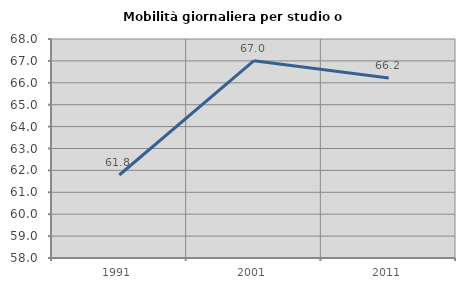
| Category | Mobilità giornaliera per studio o lavoro |
|---|---|
| 1991.0 | 61.791 |
| 2001.0 | 67.011 |
| 2011.0 | 66.214 |